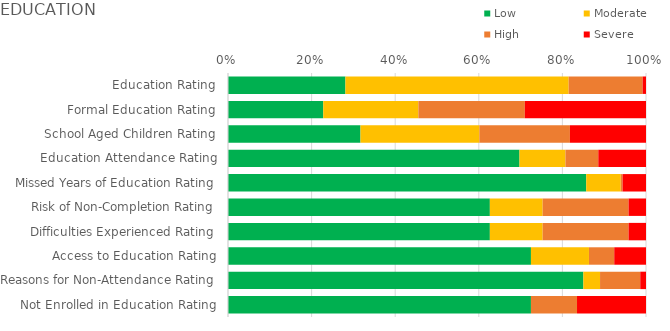
| Category | Low | Moderate | High | Severe |
|---|---|---|---|---|
| Education Rating | 0.281 | 0.534 | 0.177 | 0.008 |
| Formal Education Rating | 0.228 | 0.228 | 0.255 | 0.29 |
| School Aged Children Rating | 0.317 | 0.284 | 0.217 | 0.182 |
| Education Attendance Rating | 0.697 | 0.11 | 0.079 | 0.114 |
| Missed Years of Education Rating | 0.857 | 0.083 | 0.004 | 0.056 |
| Risk of Non-Completion Rating | 0.626 | 0.126 | 0.206 | 0.042 |
| Difficulties Experienced Rating | 0.626 | 0.126 | 0.206 | 0.042 |
| Access to Education Rating | 0.725 | 0.139 | 0.06 | 0.076 |
| Reasons for Non-Attendance Rating | 0.85 | 0.04 | 0.096 | 0.014 |
| Not Enrolled in Education Rating | 0.725 | 0 | 0.11 | 0.165 |